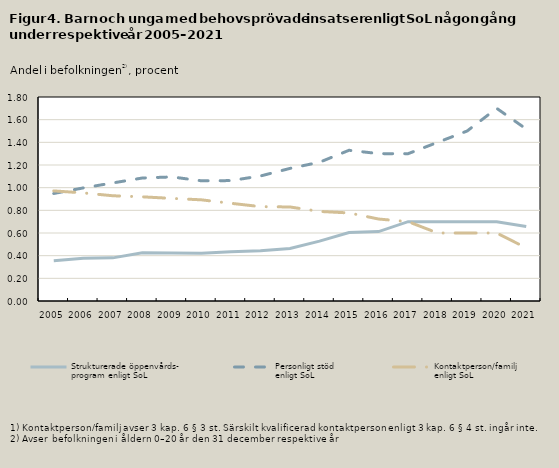
| Category | Strukturerade öppenvårds-
program enligt SoL | Personligt stöd 
enligt SoL | Kontaktperson/familj 
enligt SoL |
|---|---|---|---|
| 2005.0 | 0.356 | 0.949 | 0.972 |
| 2006.0 | 0.376 | 0.998 | 0.954 |
| 2007.0 | 0.381 | 1.042 | 0.929 |
| 2008.0 | 0.426 | 1.085 | 0.919 |
| 2009.0 | 0.425 | 1.095 | 0.905 |
| 2010.0 | 0.421 | 1.061 | 0.893 |
| 2011.0 | 0.435 | 1.062 | 0.862 |
| 2012.0 | 0.443 | 1.103 | 0.833 |
| 2013.0 | 0.463 | 1.17 | 0.83 |
| 2014.0 | 0.528 | 1.224 | 0.79 |
| 2015.0 | 0.604 | 1.33 | 0.777 |
| 2016.0 | 0.613 | 1.3 | 0.723 |
| 2017.0 | 0.7 | 1.3 | 0.7 |
| 2018.0 | 0.7 | 1.4 | 0.6 |
| 2019.0 | 0.7 | 1.5 | 0.6 |
| 2020.0 | 0.7 | 1.7 | 0.6 |
| 2021.0 | 0.657 | 1.518 | 0.468 |